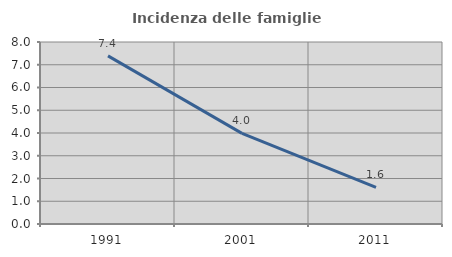
| Category | Incidenza delle famiglie numerose |
|---|---|
| 1991.0 | 7.392 |
| 2001.0 | 3.983 |
| 2011.0 | 1.612 |